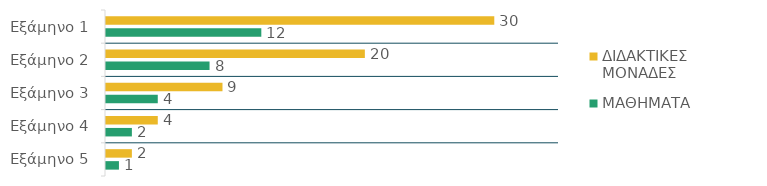
| Category | ΔΙΔΑΚΤΙΚΕΣ ΜΟΝΑΔΕΣ  | ΜΑΘΗΜΑΤΑ  |
|---|---|---|
| Εξάμηνο 1 | 30 | 12 |
| Εξάμηνο 2 | 20 | 8 |
| Εξάμηνο 3 | 9 | 4 |
| Εξάμηνο 4 | 4 | 2 |
| Εξάμηνο 5 | 2 | 1 |